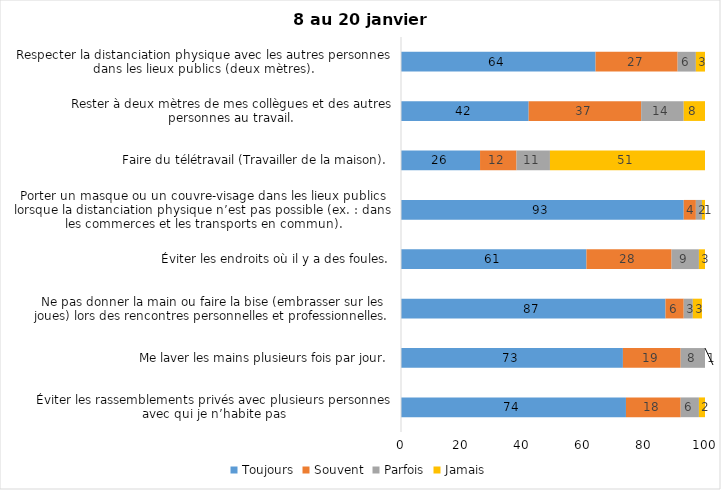
| Category | Toujours | Souvent | Parfois | Jamais |
|---|---|---|---|---|
| Éviter les rassemblements privés avec plusieurs personnes avec qui je n’habite pas | 74 | 18 | 6 | 2 |
| Me laver les mains plusieurs fois par jour. | 73 | 19 | 8 | 1 |
| Ne pas donner la main ou faire la bise (embrasser sur les joues) lors des rencontres personnelles et professionnelles. | 87 | 6 | 3 | 3 |
| Éviter les endroits où il y a des foules. | 61 | 28 | 9 | 3 |
| Porter un masque ou un couvre-visage dans les lieux publics lorsque la distanciation physique n’est pas possible (ex. : dans les commerces et les transports en commun). | 93 | 4 | 2 | 1 |
| Faire du télétravail (Travailler de la maison). | 26 | 12 | 11 | 51 |
| Rester à deux mètres de mes collègues et des autres personnes au travail. | 42 | 37 | 14 | 8 |
| Respecter la distanciation physique avec les autres personnes dans les lieux publics (deux mètres). | 64 | 27 | 6 | 3 |